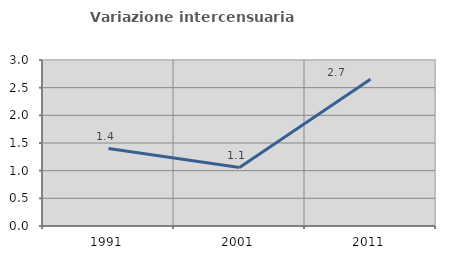
| Category | Variazione intercensuaria annua |
|---|---|
| 1991.0 | 1.399 |
| 2001.0 | 1.056 |
| 2011.0 | 2.651 |